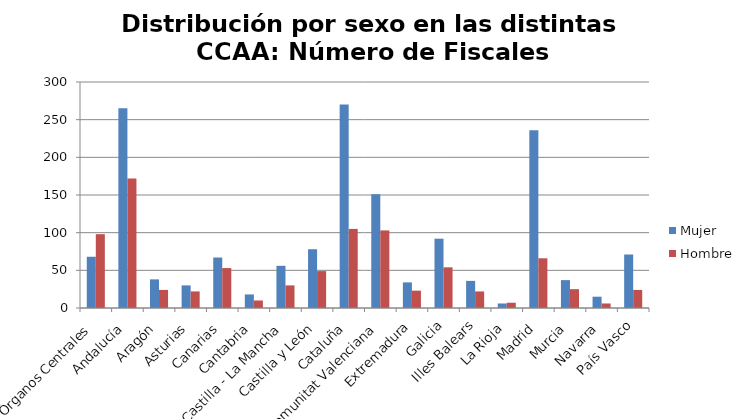
| Category | Mujer | Hombre |
|---|---|---|
| Órganos Centrales | 68 | 98 |
| Andalucía | 265 | 172 |
| Aragón | 38 | 24 |
| Asturias | 30 | 22 |
| Canarias | 67 | 53 |
| Cantabria | 18 | 10 |
| Castilla - La Mancha | 56 | 30 |
| Castilla y León | 78 | 49 |
| Cataluña | 270 | 105 |
| Comunitat Valenciana | 151 | 103 |
| Extremadura | 34 | 23 |
| Galicia | 92 | 54 |
| Illes Balears | 36 | 22 |
| La Rioja | 6 | 7 |
| Madrid | 236 | 66 |
| Murcia | 37 | 25 |
| Navarra | 15 | 6 |
| País Vasco | 71 | 24 |